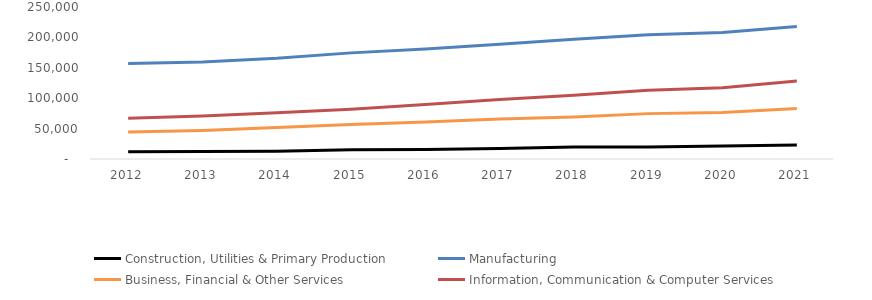
| Category | Construction, Utilities & Primary Production  | Manufacturing  | Business, Financial & Other Services | Information, Communication & Computer Services |
|---|---|---|---|---|
| 2012.0 | 11793 | 156936 | 44274 | 66995 |
| 2013.0 | 12421 | 159376 | 46873 | 70915 |
| 2014.0 | 12632 | 165519 | 51847 | 75959 |
| 2015.0 | 15096 | 174553 | 56587 | 81702 |
| 2016.0 | 15803 | 181057 | 61031 | 89509 |
| 2017.0 | 17279 | 188534 | 65852 | 97802 |
| 2018.0 | 19561 | 196962 | 69171 | 104995 |
| 2019.0 | 19570 | 204442 | 74630 | 112891 |
| 2020.0 | 21192 | 208111 | 76662 | 117071 |
| 2021.0 | 22974 | 217763 | 82936 | 128272 |